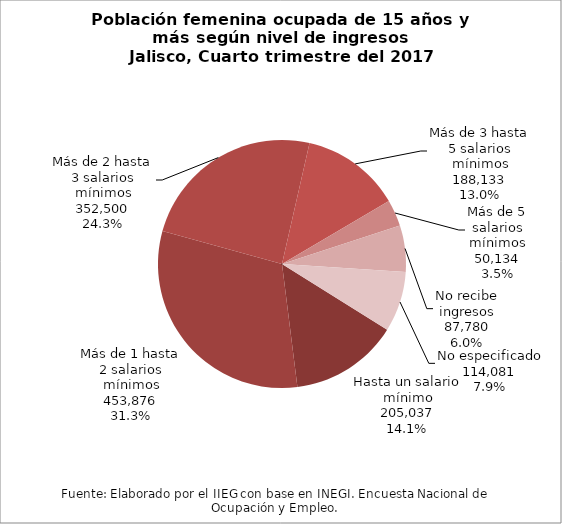
| Category | Series 0 |
|---|---|
| Hasta un salario mínimo | 205037 |
| Más de 1 hasta 2 salarios mínimos | 453876 |
| Más de 2 hasta 3 salarios mínimos | 352500 |
| Más de 3 hasta 5 salarios mínimos | 188133 |
| Más de 5 salarios mínimos | 50134 |
| No recibe ingresos | 87780 |
| No especificado | 114081 |